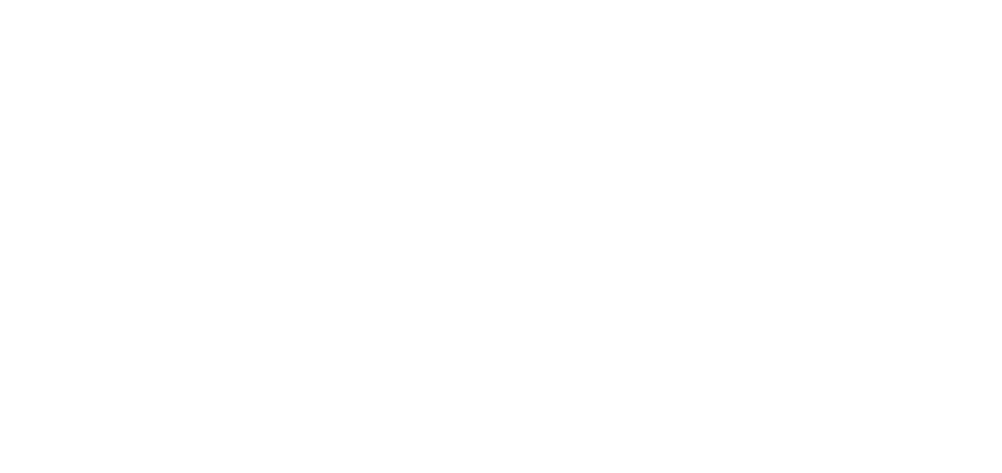
| Category | Total |
|---|---|
| Al Hodeidah | 605 |
| Hajjah | 485 |
| Marib | 226 |
| Taiz | 197 |
| Al Jawf | 171 |
| Amran | 150 |
| Ad Dali | 55 |
| Abyan | 55 |
| Sanaa | 52 |
| Ibb | 45 |
| Sadah | 44 |
| Al Bayda | 36 |
| Lahj | 36 |
| Aden | 31 |
| Hadramawt | 23 |
| Dhamar | 19 |
| Shabwah | 17 |
| Al Maharah | 14 |
| Al Mahwit | 8 |
| Raymah | 8 |
| Sanaa City | 7 |
| Socotra | 1 |